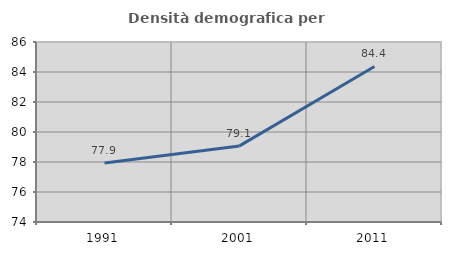
| Category | Densità demografica |
|---|---|
| 1991.0 | 77.939 |
| 2001.0 | 79.074 |
| 2011.0 | 84.371 |